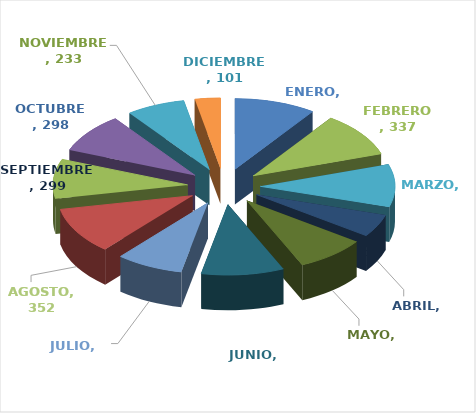
| Category | Series 0 |
|---|---|
|  ENERO | 323 |
| FEBRERO | 337 |
| MARZO | 322 |
| ABRIL | 173 |
| MAYO | 277 |
| JUNIO | 328 |
| JULIO | 267 |
| AGOSTO | 352 |
| SEPTIEMBRE | 299 |
| OCTUBRE | 298 |
| NOVIEMBRE | 233 |
| DICIEMBRE | 101 |